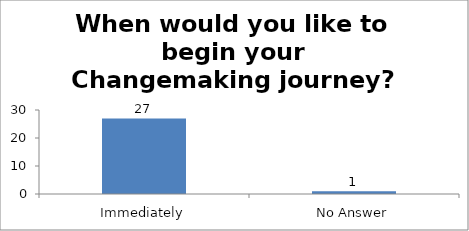
| Category | When would you like to begin your Changemaking journey?  |
|---|---|
| Immediately | 27 |
| No Answer | 1 |